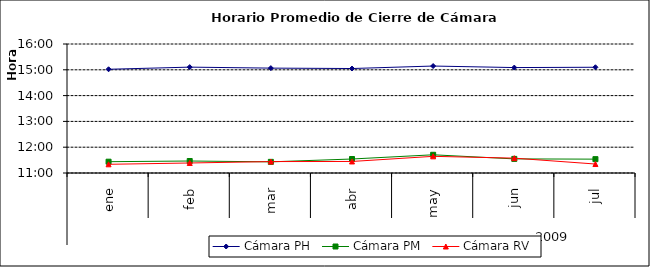
| Category | Cámara PH | Cámara PM | Cámara RV |
|---|---|---|---|
| 0 | 0.626 | 0.477 | 0.472 |
| 1 | 0.629 | 0.478 | 0.474 |
| 2 | 0.628 | 0.476 | 0.477 |
| 3 | 0.627 | 0.481 | 0.477 |
| 4 | 0.631 | 0.488 | 0.485 |
| 5 | 0.629 | 0.481 | 0.482 |
| 6 | 0.629 | 0.481 | 0.473 |